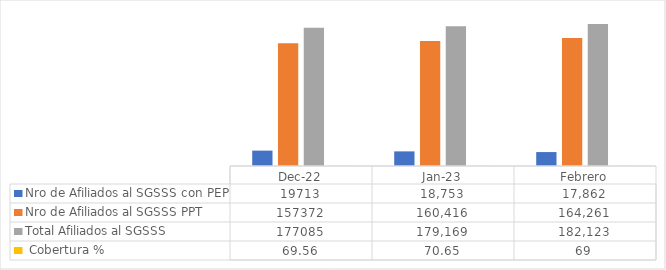
| Category | Nro de Afiliados al SGSSS con PEP | Nro de Afiliados al SGSSS PPT | Total Afiliados al SGSSS |  Cobertura % |
|---|---|---|---|---|
| dic-22 | 19713 | 157372 | 177085 | 69.56 |
| ene-23 | 18753 | 160416 | 179169 | 70.646 |
| Febrero | 17862 | 164261 | 182123 | 68.793 |